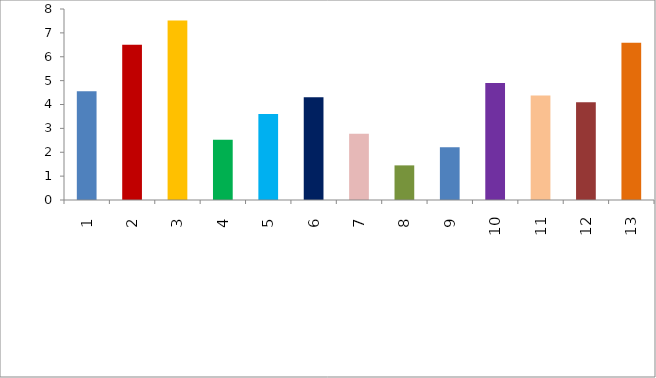
| Category | Series 0 |
|---|---|
| 0 | 4.552 |
| 1 | 6.497 |
| 2 | 7.514 |
| 3 | 2.527 |
| 4 | 3.606 |
| 5 | 4.308 |
| 6 | 2.78 |
| 7 | 1.45 |
| 8 | 2.208 |
| 9 | 4.905 |
| 10 | 4.376 |
| 11 | 4.098 |
| 12 | 6.589 |